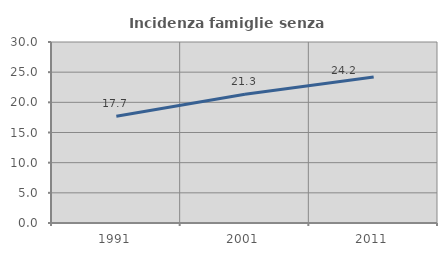
| Category | Incidenza famiglie senza nuclei |
|---|---|
| 1991.0 | 17.703 |
| 2001.0 | 21.323 |
| 2011.0 | 24.186 |